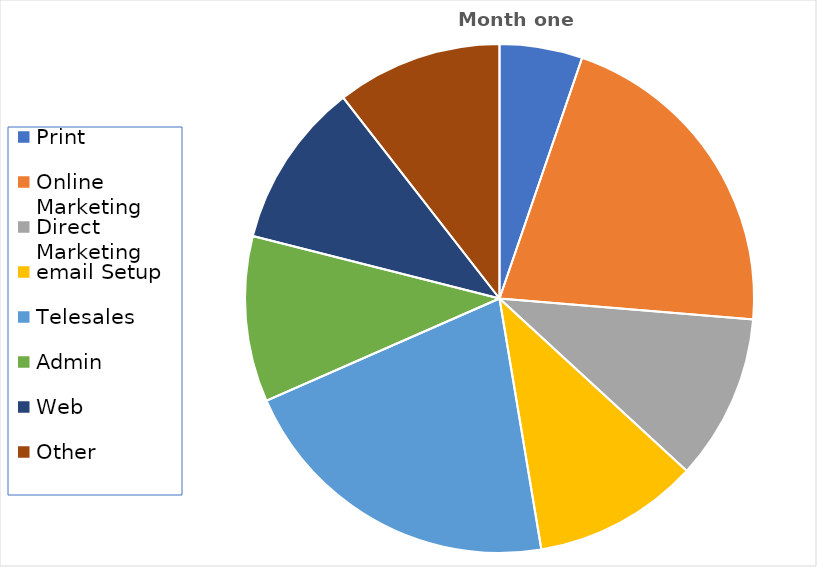
| Category | Series 0 |
|---|---|
| Print | 50 |
| Online Marketing | 200 |
| Direct Marketing | 100 |
| email Setup | 100 |
| Telesales | 200 |
| Admin | 100 |
| Web | 100 |
| Other | 100 |